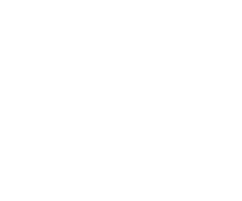
| Category | Series 0 |
|---|---|
| Transportation | 0 |
| Lodging | 0 |
| Food | 0 |
| Entertainment | 0 |
| Other | 0 |